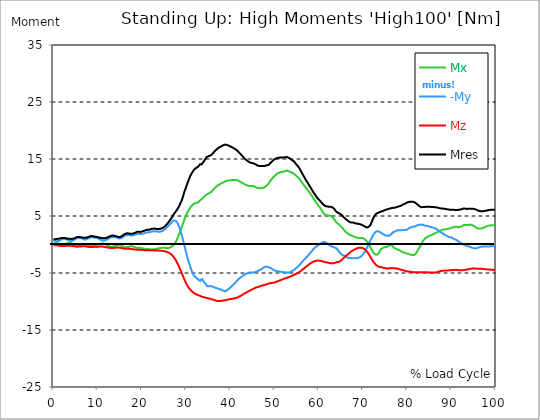
| Category |  Mx |  -My |  Mz |  Mres |
|---|---|---|---|---|
| 0.0 | 0.15 | 0.763 | -0.136 | 0.886 |
| 0.167348456675344 | 0.191 | 0.709 | -0.123 | 0.899 |
| 0.334696913350688 | 0.232 | 0.668 | -0.109 | 0.913 |
| 0.5020453700260321 | 0.245 | 0.627 | -0.123 | 0.94 |
| 0.669393826701376 | 0.245 | 0.586 | -0.123 | 0.954 |
| 0.83674228337672 | 0.259 | 0.572 | -0.136 | 0.954 |
| 1.0040907400520642 | 0.232 | 0.6 | -0.164 | 0.995 |
| 1.1621420602454444 | 0.204 | 0.627 | -0.191 | 1.036 |
| 1.3294905169207885 | 0.164 | 0.668 | -0.218 | 1.049 |
| 1.4968389735961325 | 0.109 | 0.749 | -0.245 | 1.063 |
| 1.6641874302714765 | 0.055 | 0.818 | -0.259 | 1.09 |
| 1.8315358869468206 | 0.014 | 0.886 | -0.273 | 1.117 |
| 1.9988843436221646 | -0.027 | 0.94 | -0.273 | 1.145 |
| 2.1662328002975086 | -0.027 | 0.967 | -0.273 | 1.158 |
| 2.333581256972853 | -0.014 | 0.995 | -0.273 | 1.158 |
| 2.5009297136481967 | 0.027 | 0.981 | -0.259 | 1.145 |
| 2.6682781703235405 | 0.068 | 0.981 | -0.245 | 1.131 |
| 2.8356266269988843 | 0.109 | 0.954 | -0.232 | 1.104 |
| 3.002975083674229 | 0.164 | 0.899 | -0.218 | 1.063 |
| 3.1703235403495724 | 0.218 | 0.845 | -0.204 | 1.036 |
| 3.337671997024917 | 0.259 | 0.749 | -0.204 | 1.008 |
| 3.4957233172182973 | 0.286 | 0.681 | -0.191 | 1.008 |
| 3.663071773893641 | 0.286 | 0.627 | -0.204 | 0.995 |
| 3.8304202305689854 | 0.273 | 0.6 | -0.204 | 0.981 |
| 3.997768687244329 | 0.232 | 0.613 | -0.218 | 0.981 |
| 4.165117143919673 | 0.191 | 0.64 | -0.245 | 0.981 |
| 4.332465600595017 | 0.136 | 0.668 | -0.259 | 0.995 |
| 4.499814057270361 | 0.068 | 0.736 | -0.286 | 1.022 |
| 4.667162513945706 | 0 | 0.804 | -0.313 | 1.049 |
| 4.834510970621049 | -0.082 | 0.886 | -0.327 | 1.117 |
| 5.001859427296393 | -0.15 | 0.981 | -0.354 | 1.172 |
| 5.169207883971737 | -0.191 | 1.036 | -0.368 | 1.24 |
| 5.336556340647081 | -0.218 | 1.104 | -0.382 | 1.294 |
| 5.503904797322425 | -0.232 | 1.145 | -0.382 | 1.322 |
| 5.671253253997769 | -0.218 | 1.172 | -0.368 | 1.335 |
| 5.82930457419115 | -0.177 | 1.158 | -0.368 | 1.322 |
| 5.996653030866494 | -0.136 | 1.145 | -0.354 | 1.308 |
| 6.164001487541838 | -0.095 | 1.117 | -0.341 | 1.281 |
| 6.331349944217181 | -0.041 | 1.09 | -0.327 | 1.254 |
| 6.498698400892526 | 0 | 1.036 | -0.313 | 1.226 |
| 6.66604685756787 | 0.041 | 0.967 | -0.3 | 1.213 |
| 6.833395314243213 | 0.068 | 0.913 | -0.3 | 1.185 |
| 7.000743770918558 | 0.082 | 0.872 | -0.3 | 1.158 |
| 7.168092227593902 | 0.082 | 0.858 | -0.313 | 1.158 |
| 7.335440684269246 | 0.055 | 0.872 | -0.327 | 1.185 |
| 7.50278914094459 | 0 | 0.913 | -0.354 | 1.213 |
| 7.6701375976199335 | -0.068 | 0.967 | -0.382 | 1.254 |
| 7.837486054295278 | -0.136 | 1.022 | -0.395 | 1.294 |
| 7.995537374488658 | -0.191 | 1.09 | -0.422 | 1.349 |
| 8.162885831164003 | -0.245 | 1.172 | -0.436 | 1.403 |
| 8.330234287839346 | -0.286 | 1.226 | -0.45 | 1.458 |
| 8.49758274451469 | -0.286 | 1.267 | -0.45 | 1.485 |
| 8.664931201190035 | -0.259 | 1.281 | -0.45 | 1.485 |
| 8.832279657865378 | -0.232 | 1.281 | -0.436 | 1.485 |
| 8.999628114540721 | -0.191 | 1.254 | -0.422 | 1.444 |
| 9.166976571216066 | -0.136 | 1.213 | -0.409 | 1.403 |
| 9.334325027891412 | -0.109 | 1.172 | -0.409 | 1.363 |
| 9.501673484566755 | -0.136 | 1.172 | -0.422 | 1.363 |
| 9.669021941242098 | -0.136 | 1.172 | -0.422 | 1.363 |
| 9.836370397917442 | -0.082 | 1.145 | -0.409 | 1.322 |
| 10.003718854592787 | -0.041 | 1.104 | -0.395 | 1.294 |
| 10.17106731126813 | 0.014 | 1.049 | -0.395 | 1.254 |
| 10.329118631461512 | 0.068 | 0.995 | -0.382 | 1.213 |
| 10.496467088136853 | 0.123 | 0.913 | -0.368 | 1.185 |
| 10.663815544812199 | 0.164 | 0.831 | -0.354 | 1.172 |
| 10.831164001487544 | 0.164 | 0.777 | -0.368 | 1.145 |
| 10.998512458162887 | 0.177 | 0.722 | -0.368 | 1.117 |
| 11.16586091483823 | 0.177 | 0.681 | -0.368 | 1.104 |
| 11.333209371513574 | 0.164 | 0.668 | -0.382 | 1.09 |
| 11.50055782818892 | 0.123 | 0.668 | -0.409 | 1.09 |
| 11.667906284864264 | 0.068 | 0.709 | -0.436 | 1.104 |
| 11.835254741539607 | 0.014 | 0.763 | -0.463 | 1.145 |
| 12.00260319821495 | -0.041 | 0.818 | -0.491 | 1.185 |
| 12.169951654890292 | -0.109 | 0.886 | -0.518 | 1.226 |
| 12.337300111565641 | -0.191 | 0.967 | -0.545 | 1.267 |
| 12.504648568240984 | -0.273 | 1.049 | -0.572 | 1.335 |
| 12.662699888434362 | -0.327 | 1.131 | -0.586 | 1.403 |
| 12.830048345109708 | -0.354 | 1.185 | -0.6 | 1.458 |
| 12.997396801785053 | -0.382 | 1.24 | -0.613 | 1.512 |
| 13.164745258460396 | -0.382 | 1.281 | -0.613 | 1.553 |
| 13.33209371513574 | -0.382 | 1.294 | -0.613 | 1.567 |
| 13.499442171811083 | -0.354 | 1.308 | -0.613 | 1.567 |
| 13.666790628486426 | -0.313 | 1.294 | -0.6 | 1.553 |
| 13.834139085161771 | -0.273 | 1.281 | -0.586 | 1.526 |
| 14.001487541837117 | -0.232 | 1.267 | -0.572 | 1.485 |
| 14.16883599851246 | -0.177 | 1.24 | -0.559 | 1.458 |
| 14.336184455187803 | -0.15 | 1.199 | -0.545 | 1.417 |
| 14.503532911863147 | -0.123 | 1.158 | -0.545 | 1.376 |
| 14.670881368538492 | -0.109 | 1.104 | -0.545 | 1.335 |
| 14.828932688731873 | -0.109 | 1.063 | -0.559 | 1.322 |
| 14.996281145407215 | -0.123 | 1.049 | -0.572 | 1.308 |
| 15.163629602082558 | -0.15 | 1.063 | -0.586 | 1.335 |
| 15.330978058757903 | -0.191 | 1.117 | -0.613 | 1.39 |
| 15.498326515433247 | -0.245 | 1.185 | -0.654 | 1.458 |
| 15.665674972108594 | -0.327 | 1.281 | -0.681 | 1.553 |
| 15.833023428783937 | -0.395 | 1.376 | -0.709 | 1.676 |
| 16.00037188545928 | -0.45 | 1.472 | -0.736 | 1.771 |
| 16.167720342134626 | -0.477 | 1.54 | -0.749 | 1.839 |
| 16.335068798809967 | -0.491 | 1.594 | -0.763 | 1.894 |
| 16.502417255485312 | -0.504 | 1.635 | -0.763 | 1.935 |
| 16.669765712160658 | -0.491 | 1.662 | -0.763 | 1.962 |
| 16.837114168836 | -0.463 | 1.676 | -0.763 | 1.962 |
| 17.004462625511344 | -0.422 | 1.662 | -0.763 | 1.948 |
| 17.16251394570472 | -0.382 | 1.649 | -0.763 | 1.921 |
| 17.32986240238007 | -0.341 | 1.608 | -0.763 | 1.88 |
| 17.497210859055414 | -0.313 | 1.567 | -0.763 | 1.839 |
| 17.664559315730756 | -0.3 | 1.581 | -0.777 | 1.853 |
| 17.8319077724061 | -0.327 | 1.594 | -0.804 | 1.88 |
| 17.999256229081443 | -0.354 | 1.608 | -0.831 | 1.921 |
| 18.166604685756788 | -0.395 | 1.635 | -0.845 | 1.948 |
| 18.333953142432133 | -0.45 | 1.662 | -0.872 | 2.003 |
| 18.501301599107478 | -0.518 | 1.717 | -0.899 | 2.071 |
| 18.668650055782823 | -0.559 | 1.771 | -0.913 | 2.126 |
| 18.835998512458165 | -0.6 | 1.826 | -0.913 | 2.194 |
| 19.00334696913351 | -0.613 | 1.867 | -0.913 | 2.235 |
| 19.170695425808855 | -0.6 | 1.88 | -0.913 | 2.248 |
| 19.338043882484197 | -0.586 | 1.853 | -0.913 | 2.221 |
| 19.496095202677576 | -0.586 | 1.853 | -0.913 | 2.221 |
| 19.66344365935292 | -0.586 | 1.826 | -0.913 | 2.207 |
| 19.830792116028263 | -0.6 | 1.812 | -0.927 | 2.194 |
| 19.998140572703612 | -0.654 | 1.853 | -0.954 | 2.262 |
| 20.165489029378953 | -0.681 | 1.908 | -0.967 | 2.316 |
| 20.3328374860543 | -0.695 | 1.935 | -0.967 | 2.357 |
| 20.500185942729644 | -0.695 | 1.935 | -0.981 | 2.371 |
| 20.667534399404985 | -0.749 | 1.989 | -1.008 | 2.439 |
| 20.83488285608033 | -0.79 | 2.044 | -1.008 | 2.507 |
| 21.002231312755672 | -0.818 | 2.085 | -1.022 | 2.548 |
| 21.16957976943102 | -0.818 | 2.126 | -1.022 | 2.575 |
| 21.336928226106362 | -0.804 | 2.139 | -1.022 | 2.589 |
| 21.504276682781704 | -0.79 | 2.139 | -1.022 | 2.575 |
| 21.67162513945705 | -0.804 | 2.139 | -1.022 | 2.589 |
| 21.82967645965043 | -0.831 | 2.18 | -1.036 | 2.63 |
| 21.997024916325774 | -0.858 | 2.221 | -1.036 | 2.684 |
| 22.16437337300112 | -0.858 | 2.248 | -1.036 | 2.725 |
| 22.33172182967646 | -0.858 | 2.276 | -1.022 | 2.752 |
| 22.499070286351806 | -0.858 | 2.303 | -1.022 | 2.766 |
| 22.666418743027148 | -0.845 | 2.33 | -1.036 | 2.78 |
| 22.833767199702496 | -0.831 | 2.357 | -1.036 | 2.807 |
| 23.00111565637784 | -0.818 | 2.344 | -1.036 | 2.793 |
| 23.168464113053183 | -0.804 | 2.344 | -1.036 | 2.78 |
| 23.335812569728528 | -0.736 | 2.303 | -1.022 | 2.725 |
| 23.50316102640387 | -0.709 | 2.262 | -1.036 | 2.684 |
| 23.670509483079215 | -0.695 | 2.235 | -1.063 | 2.698 |
| 23.83785793975456 | -0.668 | 2.235 | -1.076 | 2.712 |
| 23.995909259947936 | -0.64 | 2.235 | -1.076 | 2.725 |
| 24.163257716623285 | -0.613 | 2.248 | -1.09 | 2.739 |
| 24.330606173298627 | -0.6 | 2.276 | -1.104 | 2.78 |
| 24.49795462997397 | -0.586 | 2.33 | -1.117 | 2.834 |
| 24.665303086649313 | -0.572 | 2.385 | -1.117 | 2.889 |
| 24.83265154332466 | -0.572 | 2.453 | -1.145 | 2.97 |
| 25.0 | -0.572 | 2.534 | -1.158 | 3.052 |
| 25.167348456675345 | -0.586 | 2.616 | -1.185 | 3.148 |
| 25.334696913350694 | -0.586 | 2.725 | -1.226 | 3.27 |
| 25.502045370026035 | -0.6 | 2.848 | -1.267 | 3.406 |
| 25.669393826701377 | -0.613 | 2.998 | -1.294 | 3.57 |
| 25.836742283376722 | -0.613 | 3.12 | -1.349 | 3.706 |
| 26.004090740052067 | -0.613 | 3.257 | -1.403 | 3.87 |
| 26.17143919672741 | -0.586 | 3.393 | -1.485 | 4.02 |
| 26.329490516920792 | -0.559 | 3.556 | -1.553 | 4.224 |
| 26.49683897359613 | -0.491 | 3.693 | -1.635 | 4.387 |
| 26.66418743027148 | -0.409 | 3.802 | -1.744 | 4.578 |
| 26.831535886946828 | -0.313 | 3.965 | -1.867 | 4.796 |
| 26.998884343622166 | -0.218 | 4.115 | -2.003 | 5.028 |
| 27.166232800297514 | -0.095 | 4.197 | -2.166 | 5.246 |
| 27.333581256972852 | 0.068 | 4.197 | -2.33 | 5.409 |
| 27.5009297136482 | 0.245 | 4.183 | -2.521 | 5.6 |
| 27.668278170323543 | 0.45 | 4.156 | -2.739 | 5.791 |
| 27.835626626998888 | 0.695 | 4.047 | -2.97 | 5.968 |
| 28.002975083674233 | 0.995 | 3.856 | -3.216 | 6.159 |
| 28.170323540349575 | 1.294 | 3.611 | -3.475 | 6.322 |
| 28.33767199702492 | 1.621 | 3.297 | -3.747 | 6.568 |
| 28.50502045370026 | 1.948 | 2.998 | -4.033 | 6.84 |
| 28.663071773893645 | 2.303 | 2.589 | -4.347 | 7.14 |
| 28.830420230568986 | 2.643 | 2.194 | -4.66 | 7.44 |
| 28.99776868724433 | 2.984 | 1.744 | -4.973 | 7.685 |
| 29.165117143919673 | 3.352 | 1.267 | -5.287 | 8.039 |
| 29.33246560059502 | 3.706 | 0.736 | -5.6 | 8.489 |
| 29.499814057270367 | 4.088 | 0.218 | -5.914 | 8.939 |
| 29.66716251394571 | 4.469 | -0.313 | -6.213 | 9.347 |
| 29.834510970621054 | 4.796 | -0.818 | -6.499 | 9.688 |
| 30.00185942729639 | 5.11 | -1.308 | -6.772 | 10.069 |
| 30.169207883971744 | 5.423 | -1.853 | -7.031 | 10.465 |
| 30.33655634064708 | 5.696 | -2.344 | -7.249 | 10.805 |
| 30.50390479732243 | 5.9 | -2.752 | -7.453 | 11.119 |
| 30.671253253997772 | 6.118 | -3.175 | -7.644 | 11.473 |
| 30.829304574191156 | 6.336 | -3.624 | -7.808 | 11.786 |
| 30.996653030866494 | 6.554 | -4.033 | -7.957 | 12.086 |
| 31.164001487541842 | 6.718 | -4.387 | -8.094 | 12.331 |
| 31.331349944217187 | 6.854 | -4.701 | -8.216 | 12.549 |
| 31.498698400892525 | 6.976 | -5.014 | -8.339 | 12.767 |
| 31.666046857567874 | 7.085 | -5.287 | -8.448 | 12.958 |
| 31.833395314243212 | 7.167 | -5.518 | -8.543 | 13.149 |
| 32.00074377091856 | 7.222 | -5.587 | -8.639 | 13.258 |
| 32.1680922275939 | 7.29 | -5.736 | -8.707 | 13.367 |
| 32.33544068426925 | 7.303 | -5.859 | -8.761 | 13.435 |
| 32.50278914094459 | 7.331 | -5.968 | -8.816 | 13.517 |
| 32.670137597619934 | 7.372 | -6.063 | -8.857 | 13.612 |
| 32.83748605429528 | 7.481 | -6.186 | -8.911 | 13.748 |
| 33.004834510970625 | 7.617 | -6.295 | -8.952 | 13.898 |
| 33.162885831164004 | 7.78 | -6.404 | -9.007 | 14.075 |
| 33.33023428783935 | 7.862 | -6.213 | -9.061 | 14.048 |
| 33.497582744514695 | 7.93 | -6.063 | -9.129 | 14.048 |
| 33.664931201190036 | 8.026 | -6.063 | -9.184 | 14.13 |
| 33.83227965786538 | 8.175 | -6.309 | -9.211 | 14.348 |
| 33.99962811454073 | 8.339 | -6.513 | -9.225 | 14.58 |
| 34.16697657121607 | 8.475 | -6.677 | -9.238 | 14.77 |
| 34.33432502789141 | 8.571 | -6.827 | -9.306 | 14.961 |
| 34.50167348456676 | 8.666 | -7.045 | -9.347 | 15.152 |
| 34.6690219412421 | 8.775 | -7.235 | -9.388 | 15.329 |
| 34.83637039791744 | 8.87 | -7.331 | -9.415 | 15.438 |
| 35.00371885459279 | 8.911 | -7.331 | -9.443 | 15.465 |
| 35.17106731126814 | 8.979 | -7.331 | -9.47 | 15.52 |
| 35.338415767943474 | 9.048 | -7.331 | -9.511 | 15.561 |
| 35.49646708813686 | 9.102 | -7.331 | -9.552 | 15.602 |
| 35.6638155448122 | 9.197 | -7.303 | -9.579 | 15.67 |
| 35.831164001487544 | 9.347 | -7.303 | -9.62 | 15.779 |
| 35.998512458162885 | 9.497 | -7.372 | -9.661 | 15.929 |
| 36.165860914838234 | 9.633 | -7.399 | -9.702 | 16.065 |
| 36.333209371513576 | 9.783 | -7.494 | -9.729 | 16.242 |
| 36.50055782818892 | 9.92 | -7.535 | -9.77 | 16.378 |
| 36.667906284864266 | 10.042 | -7.603 | -9.824 | 16.528 |
| 36.83525474153961 | 10.138 | -7.644 | -9.865 | 16.637 |
| 37.002603198214956 | 10.233 | -7.671 | -9.892 | 16.732 |
| 37.1699516548903 | 10.356 | -7.726 | -9.906 | 16.855 |
| 37.337300111565646 | 10.451 | -7.767 | -9.92 | 16.95 |
| 37.50464856824098 | 10.533 | -7.821 | -9.906 | 17.046 |
| 37.66269988843437 | 10.601 | -7.848 | -9.906 | 17.114 |
| 37.83004834510971 | 10.669 | -7.889 | -9.892 | 17.182 |
| 37.99739680178505 | 10.737 | -7.93 | -9.879 | 17.237 |
| 38.16474525846039 | 10.805 | -7.971 | -9.879 | 17.305 |
| 38.33209371513574 | 10.86 | -8.094 | -9.838 | 17.386 |
| 38.49944217181109 | 10.914 | -8.162 | -9.824 | 17.441 |
| 38.666790628486424 | 10.996 | -8.189 | -9.797 | 17.495 |
| 38.83413908516178 | 11.064 | -8.189 | -9.77 | 17.523 |
| 39.001487541837115 | 11.132 | -8.148 | -9.756 | 17.523 |
| 39.16883599851246 | 11.173 | -8.08 | -9.729 | 17.509 |
| 39.336184455187805 | 11.2 | -7.971 | -9.702 | 17.455 |
| 39.503532911863154 | 11.228 | -7.835 | -9.674 | 17.386 |
| 39.670881368538495 | 11.214 | -7.794 | -9.633 | 17.332 |
| 39.83822982521384 | 11.241 | -7.712 | -9.606 | 17.291 |
| 39.996281145407224 | 11.255 | -7.562 | -9.579 | 17.209 |
| 40.163629602082565 | 11.282 | -7.426 | -9.565 | 17.141 |
| 40.33097805875791 | 11.309 | -7.303 | -9.552 | 17.087 |
| 40.498326515433256 | 11.323 | -7.181 | -9.524 | 17.032 |
| 40.6656749721086 | 11.309 | -7.072 | -9.497 | 16.95 |
| 40.83302342878393 | 11.309 | -6.949 | -9.47 | 16.869 |
| 41.00037188545929 | 11.296 | -6.813 | -9.443 | 16.787 |
| 41.16772034213463 | 11.309 | -6.69 | -9.402 | 16.719 |
| 41.33506879880997 | 11.296 | -6.54 | -9.375 | 16.623 |
| 41.50241725548531 | 11.282 | -6.377 | -9.334 | 16.514 |
| 41.66976571216066 | 11.255 | -6.241 | -9.279 | 16.405 |
| 41.837114168836 | 11.187 | -6.104 | -9.211 | 16.269 |
| 42.004462625511344 | 11.119 | -5.982 | -9.143 | 16.119 |
| 42.17181108218669 | 11.037 | -5.886 | -9.088 | 15.997 |
| 42.32986240238007 | 10.969 | -5.805 | -9.02 | 15.86 |
| 42.497210859055414 | 10.901 | -5.736 | -8.952 | 15.738 |
| 42.66455931573076 | 10.832 | -5.587 | -8.87 | 15.574 |
| 42.831907772406105 | 10.764 | -5.491 | -8.789 | 15.438 |
| 42.999256229081446 | 10.696 | -5.396 | -8.693 | 15.302 |
| 43.16660468575679 | 10.614 | -5.341 | -8.639 | 15.179 |
| 43.33395314243214 | 10.533 | -5.26 | -8.557 | 15.043 |
| 43.50130159910748 | 10.478 | -5.178 | -8.475 | 14.92 |
| 43.66865005578282 | 10.424 | -5.11 | -8.393 | 14.798 |
| 43.83599851245817 | 10.369 | -5.082 | -8.325 | 14.702 |
| 44.00334696913351 | 10.328 | -5.028 | -8.257 | 14.62 |
| 44.17069542580886 | 10.315 | -4.96 | -8.203 | 14.539 |
| 44.3380438824842 | 10.26 | -4.905 | -8.121 | 14.443 |
| 44.49609520267758 | 10.233 | -4.892 | -8.053 | 14.362 |
| 44.66344365935292 | 10.26 | -4.892 | -7.985 | 14.334 |
| 44.83079211602827 | 10.287 | -4.933 | -7.917 | 14.334 |
| 44.99814057270361 | 10.274 | -4.933 | -7.848 | 14.293 |
| 45.16548902937895 | 10.274 | -4.878 | -7.78 | 14.253 |
| 45.332837486054295 | 10.219 | -4.878 | -7.726 | 14.198 |
| 45.500185942729644 | 10.151 | -4.864 | -7.671 | 14.144 |
| 45.66753439940499 | 10.11 | -4.851 | -7.603 | 14.089 |
| 45.83488285608033 | 10.042 | -4.81 | -7.549 | 14.007 |
| 46.00223131275568 | 9.96 | -4.715 | -7.508 | 13.912 |
| 46.16957976943102 | 9.906 | -4.633 | -7.481 | 13.844 |
| 46.336928226106366 | 9.892 | -4.606 | -7.44 | 13.817 |
| 46.50427668278171 | 9.892 | -4.565 | -7.399 | 13.803 |
| 46.671625139457056 | 9.879 | -4.483 | -7.358 | 13.776 |
| 46.829676459650436 | 9.892 | -4.428 | -7.303 | 13.776 |
| 46.99702491632577 | 9.906 | -4.387 | -7.249 | 13.776 |
| 47.16437337300112 | 9.92 | -4.278 | -7.208 | 13.762 |
| 47.33172182967646 | 9.933 | -4.156 | -7.167 | 13.762 |
| 47.49907028635181 | 9.96 | -4.06 | -7.14 | 13.762 |
| 47.66641874302716 | 10.015 | -3.965 | -7.113 | 13.776 |
| 47.83376719970249 | 10.097 | -3.897 | -7.072 | 13.817 |
| 48.001115656377834 | 10.192 | -3.883 | -7.031 | 13.844 |
| 48.16846411305319 | 10.301 | -3.87 | -6.99 | 13.871 |
| 48.33581256972853 | 10.41 | -3.883 | -6.949 | 13.912 |
| 48.50316102640387 | 10.546 | -3.938 | -6.895 | 13.912 |
| 48.67050948307921 | 10.683 | -4.006 | -6.827 | 13.953 |
| 48.837857939754564 | 10.887 | -4.047 | -6.813 | 14.089 |
| 49.005206396429905 | 11.105 | -4.074 | -6.813 | 14.253 |
| 49.163257716623285 | 11.255 | -4.156 | -6.786 | 14.348 |
| 49.33060617329863 | 11.418 | -4.224 | -6.758 | 14.471 |
| 49.49795462997397 | 11.582 | -4.292 | -6.745 | 14.607 |
| 49.66530308664932 | 11.745 | -4.387 | -6.718 | 14.757 |
| 49.832651543324666 | 11.895 | -4.483 | -6.69 | 14.866 |
| 50.0 | 11.991 | -4.551 | -6.663 | 14.947 |
| 50.16734845667534 | 12.113 | -4.592 | -6.622 | 15.016 |
| 50.33469691335069 | 12.222 | -4.633 | -6.581 | 15.084 |
| 50.50204537002604 | 12.345 | -4.633 | -6.527 | 15.125 |
| 50.66939382670139 | 12.468 | -4.66 | -6.459 | 15.179 |
| 50.836742283376715 | 12.549 | -4.701 | -6.418 | 15.22 |
| 51.00409074005207 | 12.59 | -4.728 | -6.363 | 15.234 |
| 51.17143919672741 | 12.631 | -4.742 | -6.322 | 15.247 |
| 51.32949051692079 | 12.686 | -4.769 | -6.268 | 15.274 |
| 51.496838973596134 | 12.726 | -4.796 | -6.2 | 15.288 |
| 51.66418743027148 | 12.74 | -4.824 | -6.159 | 15.274 |
| 51.831535886946824 | 12.74 | -4.864 | -6.104 | 15.274 |
| 51.99888434362217 | 12.754 | -4.864 | -6.063 | 15.261 |
| 52.16623280029752 | 12.795 | -4.864 | -6.009 | 15.274 |
| 52.33358125697285 | 12.849 | -4.864 | -5.954 | 15.302 |
| 52.5009297136482 | 12.89 | -4.878 | -5.914 | 15.315 |
| 52.668278170323546 | 12.944 | -4.892 | -5.873 | 15.343 |
| 52.835626626998895 | 12.972 | -4.919 | -5.818 | 15.356 |
| 53.00297508367424 | 12.917 | -4.933 | -5.777 | 15.288 |
| 53.17032354034958 | 12.863 | -4.919 | -5.736 | 15.22 |
| 53.33767199702492 | 12.808 | -4.892 | -5.696 | 15.152 |
| 53.50502045370027 | 12.767 | -4.837 | -5.641 | 15.084 |
| 53.663071773893655 | 12.699 | -4.783 | -5.587 | 14.975 |
| 53.83042023056899 | 12.617 | -4.715 | -5.532 | 14.866 |
| 53.99776868724433 | 12.563 | -4.674 | -5.478 | 14.784 |
| 54.16511714391967 | 12.508 | -4.592 | -5.423 | 14.702 |
| 54.33246560059503 | 12.468 | -4.51 | -5.369 | 14.634 |
| 54.49981405727037 | 12.359 | -4.415 | -5.314 | 14.498 |
| 54.667162513945705 | 12.236 | -4.306 | -5.246 | 14.321 |
| 54.834510970621054 | 12.113 | -4.197 | -5.178 | 14.157 |
| 55.0018594272964 | 11.991 | -4.088 | -5.096 | 13.994 |
| 55.169207883971744 | 11.882 | -3.979 | -5.028 | 13.844 |
| 55.336556340647086 | 11.773 | -3.856 | -4.96 | 13.694 |
| 55.50390479732243 | 11.636 | -3.733 | -4.878 | 13.517 |
| 55.671253253997776 | 11.487 | -3.57 | -4.796 | 13.312 |
| 55.83860171067312 | 11.309 | -3.42 | -4.715 | 13.081 |
| 55.9966530308665 | 11.119 | -3.284 | -4.619 | 12.849 |
| 56.16400148754184 | 10.941 | -3.12 | -4.51 | 12.604 |
| 56.33134994421718 | 10.751 | -2.998 | -4.401 | 12.372 |
| 56.498698400892536 | 10.56 | -2.821 | -4.306 | 12.127 |
| 56.66604685756788 | 10.396 | -2.684 | -4.197 | 11.909 |
| 56.83339531424321 | 10.233 | -2.562 | -4.088 | 11.691 |
| 57.00074377091856 | 10.042 | -2.412 | -3.992 | 11.459 |
| 57.16809222759391 | 9.865 | -2.262 | -3.883 | 11.228 |
| 57.33544068426925 | 9.702 | -2.126 | -3.774 | 11.023 |
| 57.5027891409446 | 9.565 | -2.017 | -3.665 | 10.846 |
| 57.670137597619934 | 9.388 | -1.853 | -3.57 | 10.614 |
| 57.83748605429528 | 9.211 | -1.703 | -3.475 | 10.41 |
| 58.004834510970625 | 9.02 | -1.567 | -3.379 | 10.192 |
| 58.16288583116401 | 8.843 | -1.417 | -3.284 | 9.974 |
| 58.330234287839346 | 8.666 | -1.281 | -3.202 | 9.77 |
| 58.497582744514695 | 8.475 | -1.131 | -3.134 | 9.552 |
| 58.66493120119004 | 8.271 | -0.967 | -3.066 | 9.32 |
| 58.832279657865385 | 8.066 | -0.79 | -3.011 | 9.102 |
| 58.999628114540734 | 7.876 | -0.654 | -2.957 | 8.925 |
| 59.16697657121607 | 7.671 | -0.531 | -2.916 | 8.72 |
| 59.33432502789142 | 7.481 | -0.422 | -2.875 | 8.53 |
| 59.50167348456676 | 7.317 | -0.341 | -2.834 | 8.38 |
| 59.66902194124211 | 7.113 | -0.232 | -2.821 | 8.189 |
| 59.83637039791745 | 6.895 | -0.136 | -2.821 | 8.012 |
| 60.00371885459278 | 6.718 | -0.055 | -2.821 | 7.862 |
| 60.17106731126813 | 6.595 | 0 | -2.834 | 7.767 |
| 60.33841576794349 | 6.418 | 0.109 | -2.861 | 7.63 |
| 60.49646708813685 | 6.227 | 0.204 | -2.889 | 7.481 |
| 60.6638155448122 | 6.023 | 0.286 | -2.916 | 7.344 |
| 60.831164001487544 | 5.805 | 0.368 | -2.957 | 7.181 |
| 60.99851245816289 | 5.6 | 0.436 | -2.984 | 7.045 |
| 61.16586091483824 | 5.423 | 0.477 | -3.025 | 6.936 |
| 61.333209371513576 | 5.26 | 0.45 | -3.066 | 6.827 |
| 61.50055782818892 | 5.178 | 0.368 | -3.093 | 6.731 |
| 61.667906284864266 | 5.151 | 0.286 | -3.12 | 6.704 |
| 61.835254741539615 | 5.137 | 0.232 | -3.161 | 6.69 |
| 62.002603198214956 | 5.11 | 0.177 | -3.175 | 6.649 |
| 62.16995165489029 | 5.096 | 0.082 | -3.202 | 6.636 |
| 62.33730011156564 | 5.082 | -0.027 | -3.229 | 6.622 |
| 62.504648568240995 | 5.069 | -0.15 | -3.257 | 6.622 |
| 62.67199702491633 | 5.042 | -0.245 | -3.284 | 6.636 |
| 62.83004834510971 | 4.946 | -0.313 | -3.297 | 6.595 |
| 62.99739680178505 | 4.864 | -0.368 | -3.311 | 6.554 |
| 63.1647452584604 | 4.755 | -0.409 | -3.311 | 6.472 |
| 63.33209371513575 | 4.619 | -0.477 | -3.297 | 6.377 |
| 63.4994421718111 | 4.442 | -0.504 | -3.284 | 6.241 |
| 63.666790628486424 | 4.238 | -0.545 | -3.216 | 6.05 |
| 63.83413908516177 | 4.047 | -0.6 | -3.161 | 5.886 |
| 64.00148754183712 | 3.87 | -0.681 | -3.107 | 5.75 |
| 64.16883599851248 | 3.761 | -0.777 | -3.079 | 5.655 |
| 64.3361844551878 | 3.679 | -0.94 | -3.079 | 5.573 |
| 64.50353291186315 | 3.584 | -1.117 | -3.066 | 5.518 |
| 64.6708813685385 | 3.461 | -1.308 | -3.025 | 5.45 |
| 64.83822982521384 | 3.325 | -1.499 | -2.943 | 5.382 |
| 65.00557828188919 | 3.188 | -1.662 | -2.848 | 5.3 |
| 65.16362960208257 | 3.052 | -1.771 | -2.739 | 5.191 |
| 65.3309780587579 | 2.916 | -1.853 | -2.63 | 5.055 |
| 65.49832651543326 | 2.766 | -1.908 | -2.507 | 4.905 |
| 65.6656749721086 | 2.589 | -1.962 | -2.357 | 4.783 |
| 65.83302342878395 | 2.425 | -1.989 | -2.235 | 4.66 |
| 66.00037188545929 | 2.289 | -2.003 | -2.126 | 4.537 |
| 66.16772034213463 | 2.18 | -2.085 | -2.017 | 4.428 |
| 66.33506879880998 | 2.098 | -2.235 | -1.894 | 4.319 |
| 66.50241725548531 | 1.989 | -2.303 | -1.785 | 4.224 |
| 66.66976571216065 | 1.88 | -2.344 | -1.676 | 4.129 |
| 66.83711416883601 | 1.771 | -2.357 | -1.567 | 4.033 |
| 67.00446262551135 | 1.676 | -2.33 | -1.472 | 3.938 |
| 67.1718110821867 | 1.594 | -2.344 | -1.363 | 3.883 |
| 67.32986240238007 | 1.581 | -2.385 | -1.254 | 3.856 |
| 67.49721085905541 | 1.553 | -2.425 | -1.145 | 3.87 |
| 67.66455931573076 | 1.485 | -2.425 | -1.076 | 3.87 |
| 67.83190777240611 | 1.417 | -2.425 | -0.995 | 3.829 |
| 67.99925622908145 | 1.403 | -2.425 | -0.913 | 3.802 |
| 68.16660468575678 | 1.335 | -2.412 | -0.845 | 3.747 |
| 68.33395314243214 | 1.254 | -2.385 | -0.777 | 3.693 |
| 68.50130159910749 | 1.213 | -2.398 | -0.722 | 3.679 |
| 68.66865005578282 | 1.213 | -2.385 | -0.668 | 3.679 |
| 68.83599851245816 | 1.158 | -2.357 | -0.627 | 3.624 |
| 69.00334696913352 | 1.158 | -2.33 | -0.6 | 3.611 |
| 69.17069542580886 | 1.145 | -2.276 | -0.572 | 3.584 |
| 69.3380438824842 | 1.145 | -2.207 | -0.559 | 3.556 |
| 69.50539233915956 | 1.158 | -2.126 | -0.559 | 3.515 |
| 69.66344365935292 | 1.158 | -2.017 | -0.586 | 3.475 |
| 69.83079211602826 | 1.131 | -1.894 | -0.6 | 3.393 |
| 69.99814057270362 | 1.104 | -1.717 | -0.654 | 3.338 |
| 70.16548902937896 | 1.049 | -1.553 | -0.709 | 3.284 |
| 70.33283748605429 | 0.967 | -1.376 | -0.79 | 3.202 |
| 70.50018594272964 | 0.858 | -1.145 | -0.899 | 3.107 |
| 70.667534399405 | 0.736 | -0.927 | -1.022 | 3.025 |
| 70.83488285608033 | 0.6 | -0.681 | -1.172 | 2.998 |
| 71.00223131275568 | 0.45 | -0.422 | -1.349 | 2.998 |
| 71.16957976943102 | 0.259 | -0.136 | -1.526 | 3.025 |
| 71.33692822610637 | 0.041 | 0.136 | -1.717 | 3.134 |
| 71.50427668278171 | -0.191 | 0.409 | -1.935 | 3.27 |
| 71.67162513945706 | -0.45 | 0.695 | -2.153 | 3.42 |
| 71.8389735961324 | -0.736 | 0.954 | -2.385 | 3.679 |
| 71.99702491632577 | -0.967 | 1.213 | -2.589 | 3.965 |
| 72.16437337300113 | -1.213 | 1.472 | -2.821 | 4.319 |
| 72.33172182967647 | -1.403 | 1.69 | -3.011 | 4.606 |
| 72.49907028635181 | -1.567 | 1.894 | -3.175 | 4.864 |
| 72.66641874302715 | -1.676 | 2.057 | -3.338 | 5.069 |
| 72.8337671997025 | -1.758 | 2.194 | -3.488 | 5.246 |
| 73.00111565637783 | -1.785 | 2.276 | -3.611 | 5.382 |
| 73.16846411305319 | -1.771 | 2.33 | -3.72 | 5.478 |
| 73.33581256972853 | -1.73 | 2.344 | -3.802 | 5.546 |
| 73.50316102640387 | -1.581 | 2.316 | -3.87 | 5.587 |
| 73.67050948307921 | -1.39 | 2.276 | -3.924 | 5.627 |
| 73.83785793975457 | -1.117 | 2.18 | -3.924 | 5.696 |
| 74.00520639642991 | -0.913 | 2.098 | -3.938 | 5.75 |
| 74.16325771662328 | -0.777 | 2.03 | -3.992 | 5.791 |
| 74.33060617329863 | -0.668 | 1.962 | -4.033 | 5.832 |
| 74.49795462997398 | -0.6 | 1.853 | -4.074 | 5.873 |
| 74.66530308664932 | -0.545 | 1.758 | -4.101 | 5.927 |
| 74.83265154332466 | -0.491 | 1.676 | -4.129 | 5.995 |
| 75.00000000000001 | -0.477 | 1.621 | -4.142 | 6.063 |
| 75.16734845667534 | -0.518 | 1.594 | -4.169 | 6.104 |
| 75.3346969133507 | -0.436 | 1.553 | -4.197 | 6.118 |
| 75.50204537002605 | -0.368 | 1.526 | -4.197 | 6.172 |
| 75.66939382670138 | -0.3 | 1.485 | -4.197 | 6.213 |
| 75.83674228337672 | -0.245 | 1.512 | -4.183 | 6.254 |
| 76.00409074005208 | -0.177 | 1.553 | -4.183 | 6.281 |
| 76.17143919672742 | -0.136 | 1.662 | -4.169 | 6.322 |
| 76.33878765340276 | -0.109 | 1.771 | -4.156 | 6.363 |
| 76.49683897359614 | -0.15 | 1.894 | -4.142 | 6.39 |
| 76.66418743027148 | -0.232 | 2.03 | -4.142 | 6.418 |
| 76.83153588694682 | -0.395 | 2.153 | -4.142 | 6.445 |
| 76.99888434362218 | -0.6 | 2.276 | -4.156 | 6.472 |
| 77.16623280029752 | -0.6 | 2.248 | -4.197 | 6.445 |
| 77.33358125697285 | -0.681 | 2.316 | -4.197 | 6.486 |
| 77.5009297136482 | -0.749 | 2.398 | -4.197 | 6.527 |
| 77.66827817032356 | -0.872 | 2.453 | -4.21 | 6.568 |
| 77.83562662699889 | -0.94 | 2.48 | -4.224 | 6.608 |
| 78.00297508367423 | -0.913 | 2.453 | -4.265 | 6.636 |
| 78.17032354034959 | -0.981 | 2.521 | -4.306 | 6.704 |
| 78.33767199702493 | -1.049 | 2.534 | -4.36 | 6.731 |
| 78.50502045370027 | -1.09 | 2.494 | -4.401 | 6.772 |
| 78.67236891037561 | -1.185 | 2.494 | -4.428 | 6.827 |
| 78.83042023056899 | -1.281 | 2.521 | -4.469 | 6.908 |
| 78.99776868724433 | -1.363 | 2.562 | -4.497 | 7.004 |
| 79.16511714391969 | -1.39 | 2.548 | -4.537 | 7.031 |
| 79.33246560059503 | -1.417 | 2.548 | -4.565 | 7.085 |
| 79.49981405727036 | -1.458 | 2.548 | -4.606 | 7.154 |
| 79.66716251394571 | -1.526 | 2.562 | -4.674 | 7.263 |
| 79.83451097062107 | -1.581 | 2.589 | -4.701 | 7.331 |
| 80.00185942729641 | -1.594 | 2.63 | -4.715 | 7.372 |
| 80.16920788397174 | -1.635 | 2.712 | -4.728 | 7.412 |
| 80.33655634064709 | -1.649 | 2.793 | -4.742 | 7.44 |
| 80.50390479732243 | -1.744 | 2.889 | -4.742 | 7.481 |
| 80.67125325399778 | -1.771 | 2.957 | -4.769 | 7.508 |
| 80.83860171067312 | -1.771 | 2.998 | -4.796 | 7.481 |
| 80.99665303086651 | -1.799 | 3.052 | -4.81 | 7.481 |
| 81.16400148754184 | -1.88 | 3.093 | -4.824 | 7.508 |
| 81.3313499442172 | -1.88 | 3.12 | -4.851 | 7.494 |
| 81.49869840089255 | -1.88 | 3.12 | -4.851 | 7.467 |
| 81.66604685756786 | -1.812 | 3.134 | -4.851 | 7.399 |
| 81.83339531424322 | -1.69 | 3.188 | -4.864 | 7.317 |
| 82.00074377091858 | -1.553 | 3.27 | -4.878 | 7.235 |
| 82.16809222759392 | -1.376 | 3.338 | -4.878 | 7.126 |
| 82.33544068426926 | -1.104 | 3.379 | -4.878 | 7.004 |
| 82.50278914094459 | -0.872 | 3.42 | -4.878 | 6.895 |
| 82.67013759761994 | -0.64 | 3.461 | -4.878 | 6.786 |
| 82.83748605429528 | -0.477 | 3.488 | -4.878 | 6.69 |
| 83.00483451097062 | -0.245 | 3.488 | -4.878 | 6.608 |
| 83.17218296764597 | 0 | 3.475 | -4.864 | 6.54 |
| 83.33023428783935 | 0.273 | 3.488 | -4.878 | 6.527 |
| 83.4975827445147 | 0.559 | 3.488 | -4.892 | 6.568 |
| 83.66493120119004 | 0.709 | 3.447 | -4.878 | 6.568 |
| 83.83227965786537 | 0.858 | 3.366 | -4.878 | 6.581 |
| 83.99962811454073 | 1.008 | 3.311 | -4.878 | 6.581 |
| 84.16697657121607 | 1.145 | 3.284 | -4.878 | 6.608 |
| 84.33432502789142 | 1.24 | 3.27 | -4.878 | 6.622 |
| 84.50167348456677 | 1.335 | 3.27 | -4.878 | 6.636 |
| 84.6690219412421 | 1.39 | 3.229 | -4.892 | 6.636 |
| 84.83637039791745 | 1.444 | 3.188 | -4.905 | 6.622 |
| 85.0037188545928 | 1.512 | 3.134 | -4.905 | 6.608 |
| 85.17106731126813 | 1.567 | 3.093 | -4.905 | 6.608 |
| 85.33841576794349 | 1.635 | 3.039 | -4.919 | 6.595 |
| 85.50576422461883 | 1.676 | 3.025 | -4.919 | 6.581 |
| 85.66381554481221 | 1.73 | 2.998 | -4.919 | 6.568 |
| 85.83116400148755 | 1.799 | 2.957 | -4.905 | 6.568 |
| 85.99851245816289 | 1.867 | 2.93 | -4.892 | 6.554 |
| 86.16586091483823 | 1.921 | 2.889 | -4.905 | 6.554 |
| 86.33320937151358 | 1.962 | 2.848 | -4.905 | 6.54 |
| 86.50055782818893 | 2.03 | 2.78 | -4.892 | 6.527 |
| 86.66790628486427 | 2.112 | 2.671 | -4.878 | 6.513 |
| 86.83525474153961 | 2.194 | 2.575 | -4.851 | 6.486 |
| 87.00260319821496 | 2.276 | 2.494 | -4.783 | 6.459 |
| 87.16995165489031 | 2.344 | 2.412 | -4.715 | 6.404 |
| 87.33730011156564 | 2.371 | 2.316 | -4.687 | 6.377 |
| 87.504648568241 | 2.439 | 2.194 | -4.66 | 6.35 |
| 87.67199702491634 | 2.494 | 2.098 | -4.633 | 6.322 |
| 87.83004834510972 | 2.534 | 2.017 | -4.619 | 6.309 |
| 87.99739680178506 | 2.562 | 1.948 | -4.619 | 6.295 |
| 88.1647452584604 | 2.589 | 1.88 | -4.606 | 6.295 |
| 88.33209371513574 | 2.616 | 1.785 | -4.592 | 6.295 |
| 88.49944217181108 | 2.657 | 1.69 | -4.578 | 6.268 |
| 88.66679062848644 | 2.671 | 1.635 | -4.565 | 6.254 |
| 88.83413908516178 | 2.698 | 1.567 | -4.565 | 6.213 |
| 89.00148754183712 | 2.725 | 1.485 | -4.551 | 6.159 |
| 89.16883599851246 | 2.739 | 1.417 | -4.537 | 6.159 |
| 89.33618445518782 | 2.752 | 1.39 | -4.537 | 6.159 |
| 89.50353291186315 | 2.793 | 1.308 | -4.524 | 6.118 |
| 89.6708813685385 | 2.821 | 1.281 | -4.51 | 6.104 |
| 89.83822982521386 | 2.861 | 1.267 | -4.51 | 6.104 |
| 90.00557828188919 | 2.916 | 1.24 | -4.497 | 6.104 |
| 90.16362960208257 | 2.97 | 1.185 | -4.469 | 6.104 |
| 90.3309780587579 | 3.011 | 1.09 | -4.469 | 6.104 |
| 90.49832651543326 | 3.039 | 1.008 | -4.456 | 6.077 |
| 90.66567497210859 | 3.079 | 0.94 | -4.469 | 6.063 |
| 90.83302342878395 | 3.12 | 0.886 | -4.469 | 6.063 |
| 91.00037188545929 | 3.134 | 0.858 | -4.442 | 6.05 |
| 91.16772034213463 | 3.134 | 0.804 | -4.428 | 6.036 |
| 91.33506879880998 | 3.066 | 0.695 | -4.456 | 6.023 |
| 91.50241725548533 | 2.998 | 0.586 | -4.483 | 6.036 |
| 91.66976571216065 | 2.998 | 0.504 | -4.51 | 6.063 |
| 91.83711416883601 | 3.093 | 0.409 | -4.524 | 6.132 |
| 92.00446262551137 | 3.066 | 0.341 | -4.524 | 6.104 |
| 92.1718110821867 | 3.12 | 0.259 | -4.524 | 6.132 |
| 92.33915953886203 | 3.216 | 0.191 | -4.524 | 6.2 |
| 92.49721085905541 | 3.297 | 0.123 | -4.51 | 6.254 |
| 92.66455931573077 | 3.393 | 0.055 | -4.497 | 6.322 |
| 92.83190777240611 | 3.42 | -0.014 | -4.469 | 6.322 |
| 92.99925622908145 | 3.447 | -0.095 | -4.456 | 6.309 |
| 93.1666046857568 | 3.447 | -0.164 | -4.415 | 6.281 |
| 93.33395314243214 | 3.42 | -0.232 | -4.401 | 6.268 |
| 93.50130159910749 | 3.42 | -0.273 | -4.387 | 6.241 |
| 93.66865005578283 | 3.42 | -0.3 | -4.387 | 6.241 |
| 93.83599851245818 | 3.447 | -0.341 | -4.347 | 6.268 |
| 94.00334696913353 | 3.488 | -0.354 | -4.306 | 6.281 |
| 94.17069542580886 | 3.488 | -0.409 | -4.278 | 6.281 |
| 94.3380438824842 | 3.475 | -0.463 | -4.251 | 6.268 |
| 94.50539233915954 | 3.447 | -0.518 | -4.238 | 6.268 |
| 94.66344365935292 | 3.42 | -0.572 | -4.224 | 6.268 |
| 94.83079211602828 | 3.366 | -0.613 | -4.224 | 6.268 |
| 94.99814057270362 | 3.297 | -0.654 | -4.224 | 6.254 |
| 95.16548902937897 | 3.216 | -0.668 | -4.224 | 6.227 |
| 95.33283748605432 | 3.12 | -0.681 | -4.224 | 6.2 |
| 95.50018594272963 | 3.025 | -0.681 | -4.224 | 6.145 |
| 95.66753439940499 | 2.943 | -0.668 | -4.238 | 6.104 |
| 95.83488285608034 | 2.875 | -0.627 | -4.251 | 6.036 |
| 96.00223131275567 | 2.834 | -0.572 | -4.251 | 5.982 |
| 96.16957976943102 | 2.807 | -0.518 | -4.251 | 5.927 |
| 96.33692822610638 | 2.807 | -0.463 | -4.251 | 5.886 |
| 96.50427668278171 | 2.807 | -0.409 | -4.251 | 5.845 |
| 96.67162513945706 | 2.821 | -0.395 | -4.251 | 5.845 |
| 96.8389735961324 | 2.834 | -0.382 | -4.251 | 5.832 |
| 96.99702491632577 | 2.875 | -0.368 | -4.265 | 5.818 |
| 97.16437337300111 | 2.916 | -0.354 | -4.278 | 5.832 |
| 97.33172182967647 | 2.97 | -0.354 | -4.306 | 5.845 |
| 97.49907028635181 | 3.025 | -0.341 | -4.319 | 5.886 |
| 97.66641874302715 | 3.079 | -0.341 | -4.333 | 5.914 |
| 97.8337671997025 | 3.148 | -0.327 | -4.36 | 5.941 |
| 98.00111565637785 | 3.202 | -0.341 | -4.36 | 5.968 |
| 98.16846411305319 | 3.243 | -0.341 | -4.374 | 5.995 |
| 98.33581256972855 | 3.284 | -0.341 | -4.387 | 6.023 |
| 98.50316102640389 | 3.297 | -0.341 | -4.401 | 6.05 |
| 98.67050948307921 | 3.325 | -0.327 | -4.401 | 6.077 |
| 98.83785793975456 | 3.352 | -0.313 | -4.415 | 6.077 |
| 99.0052063964299 | 3.352 | -0.313 | -4.415 | 6.091 |
| 99.17255485310525 | 3.393 | -0.327 | -4.415 | 6.118 |
| 99.33060617329863 | 3.393 | -0.286 | -4.428 | 6.118 |
| 99.49795462997399 | 3.366 | -0.273 | -4.456 | 6.118 |
| 99.66530308664933 | 3.297 | -0.3 | -4.483 | 6.104 |
| 99.83265154332467 | 3.243 | -0.3 | -4.497 | 6.104 |
| 100.0 | 3.229 | -0.327 | -4.524 | 6.104 |